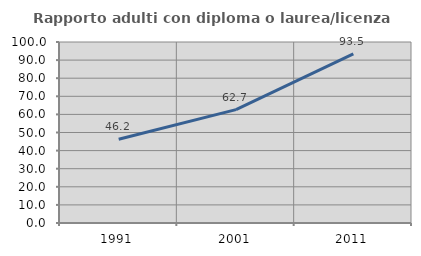
| Category | Rapporto adulti con diploma o laurea/licenza media  |
|---|---|
| 1991.0 | 46.233 |
| 2001.0 | 62.659 |
| 2011.0 | 93.484 |